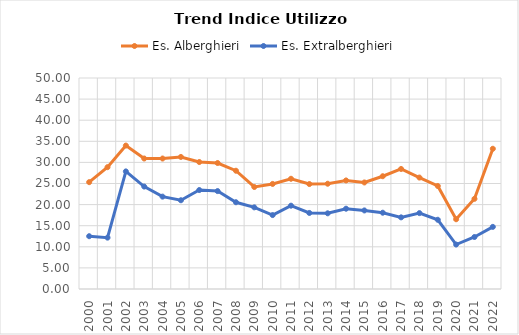
| Category | Es. Alberghieri | Es. Extralberghieri |
|---|---|---|
| 2000.0 | 25.318 | 12.511 |
| 2001.0 | 28.867 | 12.17 |
| 2002.0 | 33.988 | 27.863 |
| 2003.0 | 30.921 | 24.276 |
| 2004.0 | 30.918 | 21.888 |
| 2005.0 | 31.291 | 21.027 |
| 2006.0 | 30.09 | 23.448 |
| 2007.0 | 29.855 | 23.203 |
| 2008.0 | 28.026 | 20.557 |
| 2009.0 | 24.172 | 19.347 |
| 2010.0 | 24.897 | 17.52 |
| 2011.0 | 26.123 | 19.743 |
| 2012.0 | 24.872 | 18.02 |
| 2013.0 | 24.944 | 17.936 |
| 2014.0 | 25.725 | 19.029 |
| 2015.0 | 25.244 | 18.617 |
| 2016.0 | 26.726 | 18.078 |
| 2017.0 | 28.443 | 16.977 |
| 2018.0 | 26.406 | 17.983 |
| 2019.0 | 24.416 | 16.405 |
| 2020.0 | 16.529 | 10.537 |
| 2021.0 | 21.369 | 12.322 |
| 2022.0 | 33.233 | 14.722 |